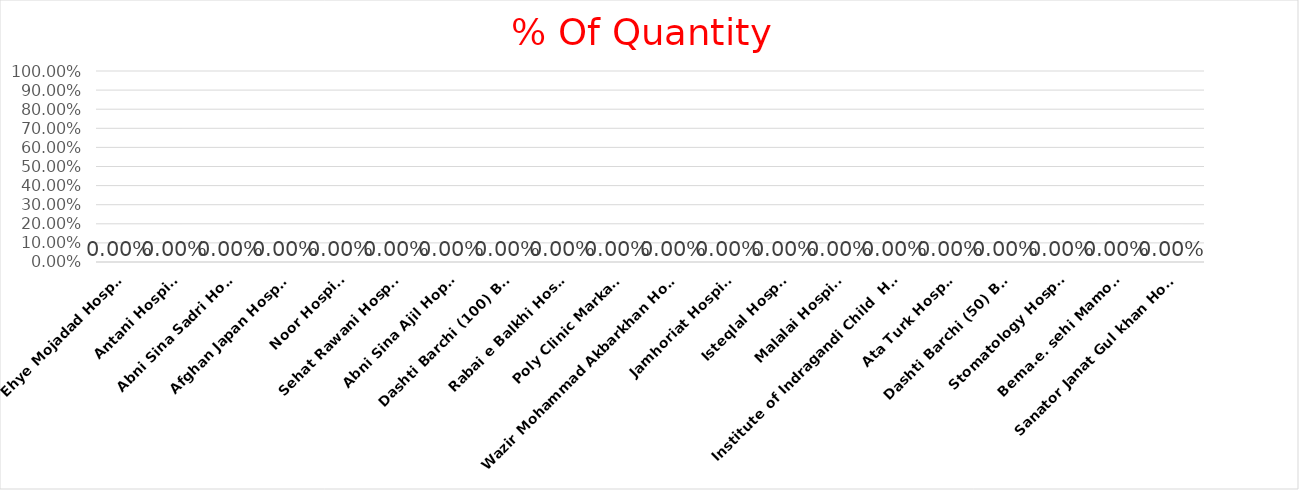
| Category | % Of Quantity |
|---|---|
| Ehye Mojadad Hospital | 0 |
| Antani Hospital | 0 |
| Abni Sina Sadri Hopital | 0 |
| Afghan Japan Hospital | 0 |
| Noor Hospital | 0 |
| Sehat Rawani Hospital | 0 |
| Abni Sina Ajil Hopital | 0 |
| Dashti Barchi (100) Beds | 0 |
| Rabai e Balkhi Hospital | 0 |
| Poly Clinic Markazee | 0 |
| Wazir Mohammad Akbarkhan Hospital | 0 |
| Jamhoriat Hospital  | 0 |
| Isteqlal Hospital | 0 |
| Malalai Hospital | 0 |
| Institute of Indragandi Child  Health | 0 |
| Ata Turk Hospital | 0 |
| Dashti Barchi (50) Beds | 0 |
| Stomatology Hospital | 0 |
| Bema.e. sehi Mamoorin | 0 |
| Sanator Janat Gul khan Hopital | 0 |